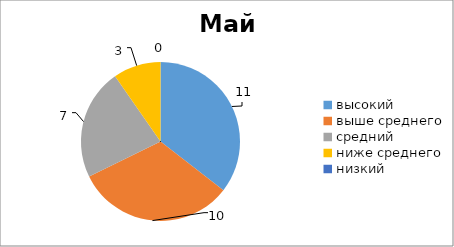
| Category | Series 0 |
|---|---|
| высокий  | 11 |
| выше среднего | 10 |
| средний | 7 |
| ниже среднего | 3 |
| низкий | 0 |